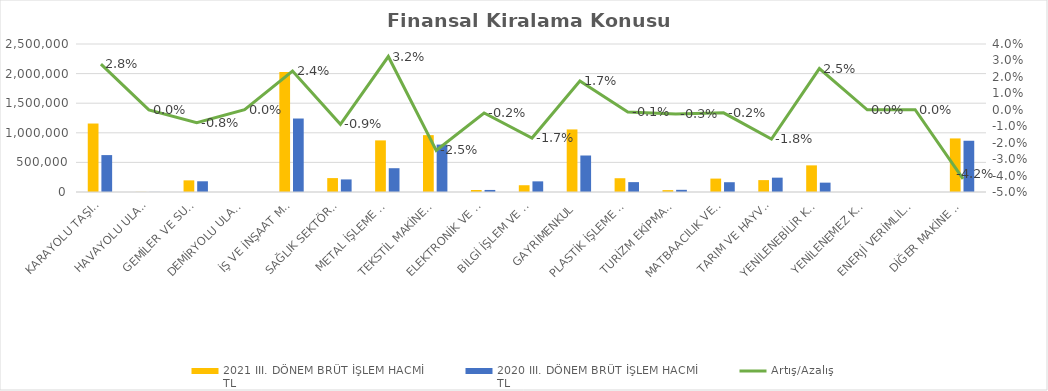
| Category | 2021 III. DÖNEM BRÜT İŞLEM HACMİ 
TL | 2020 III. DÖNEM BRÜT İŞLEM HACMİ 
TL |
|---|---|---|
| KARAYOLU TAŞITLARI | 1156717.996 | 623458.861 |
| HAVAYOLU ULAŞIM ARAÇLARI | 1756 | 1412.553 |
| GEMİLER VE SUDA YÜZEN TAŞIT VE ARAÇLAR | 196661.512 | 180851.11 |
| DEMİRYOLU ULAŞIM ARAÇLARI | 293 | 0 |
| İŞ VE İNŞAAT MAKİNELERİ | 2027623.334 | 1241311.898 |
| SAĞLIK SEKTÖRÜ VE ESTETİK EKİPMANLARI | 235018.016 | 212464.691 |
| METAL İŞLEME MAKİNELERİ | 871717.751 | 401834.152 |
| TEKSTİL MAKİNELERİ | 960440.65 | 800978.765 |
| ELEKTRONİK VE OPTİK CİHAZLAR | 33864.124 | 34679.181 |
| BİLGİ İŞLEM VE BÜRO SİSTEMLERİ | 114350.742 | 179786.935 |
| GAYRİMENKUL | 1056942.081 | 616531.677 |
| PLASTİK İŞLEME MAKİNELERİ | 232579.591 | 166795.071 |
| TURİZM EKİPMANLARI | 31581.098 | 36736.784 |
| MATBAACILIK VE KAĞIT İŞLEME MAKİNELERİ | 226526.789 | 165249.357 |
| TARIM VE HAYVANCILIK MAKİNELERİ | 200783.856 | 242189.251 |
| YENİLENEBİLİR KAYNAKLI ELEKTRİK ENERJİSİ ÜRETİM EKİPMANLARI | 449903.632 | 157935.2 |
| YENİLENEMEZ KAYNAKLI ELEKTRİK ENERJİSİ ÜRETİM EKİPMANLARI | 0 | 0 |
| ENERJİ VERİMLİLİĞİ EKİPMANLARI | 186.993 | 0 |
| DİĞER MAKİNE VE EKİPMANLAR | 904989.293 | 865622.419 |